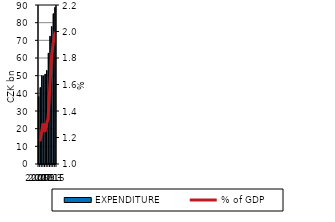
| Category | EXPENDITURE |
|---|---|
| 2005.0 | 38.146 |
| 2006.0 | 43.268 |
| 2007.0 | 50.009 |
| 2008.0 | 49.872 |
| 2009.0 | 50.875 |
| 2010.0 | 52.974 |
| 2011.0 | 62.753 |
| 2012.0 | 72.36 |
| 2013.0 | 77.853 |
| 2014.0 | 85.104 |
| 2015.0 | 88.663 |